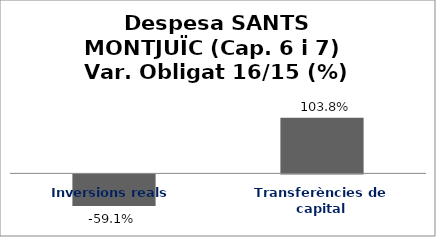
| Category | Series 0 |
|---|---|
| Inversions reals | -0.591 |
| Transferències de capital | 1.038 |